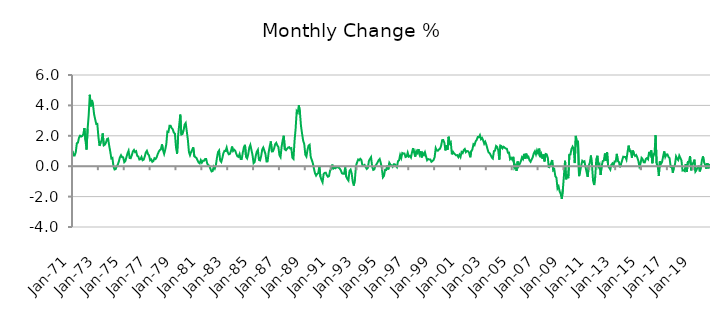
| Category | Series 0 |
|---|---|
| 1971-01-01 | 1.014 |
| 1971-02-01 | 0.711 |
| 1971-03-01 | 0.712 |
| 1971-04-01 | 0.919 |
| 1971-05-01 | 1.51 |
| 1971-06-01 | 1.551 |
| 1971-07-01 | 1.878 |
| 1971-08-01 | 2.005 |
| 1971-09-01 | 1.95 |
| 1971-10-01 | 1.987 |
| 1971-11-01 | 2.104 |
| 1971-12-01 | 2.509 |
| 1972-01-01 | 1.699 |
| 1972-02-01 | 1.094 |
| 1972-03-01 | 2.462 |
| 1972-04-01 | 3.36 |
| 1972-05-01 | 4.697 |
| 1972-06-01 | 3.937 |
| 1972-07-01 | 4.355 |
| 1972-08-01 | 4.026 |
| 1972-09-01 | 3.417 |
| 1972-10-01 | 3.088 |
| 1972-11-01 | 2.774 |
| 1972-12-01 | 2.784 |
| 1973-01-01 | 1.938 |
| 1973-02-01 | 1.343 |
| 1973-03-01 | 1.524 |
| 1973-04-01 | 1.712 |
| 1973-05-01 | 2.158 |
| 1973-06-01 | 1.373 |
| 1973-07-01 | 1.418 |
| 1973-08-01 | 1.551 |
| 1973-09-01 | 1.782 |
| 1973-10-01 | 1.816 |
| 1973-11-01 | 1.359 |
| 1973-12-01 | 0.961 |
| 1974-01-01 | 0.511 |
| 1974-02-01 | 0.548 |
| 1974-03-01 | -0.022 |
| 1974-04-01 | -0.216 |
| 1974-05-01 | -0.191 |
| 1974-06-01 | 0.007 |
| 1974-07-01 | 0.097 |
| 1974-08-01 | 0.326 |
| 1974-09-01 | 0.591 |
| 1974-10-01 | 0.722 |
| 1974-11-01 | 0.594 |
| 1974-12-01 | 0.583 |
| 1975-01-01 | 0.268 |
| 1975-02-01 | 0.337 |
| 1975-03-01 | 0.597 |
| 1975-04-01 | 0.845 |
| 1975-05-01 | 1.017 |
| 1975-06-01 | 0.539 |
| 1975-07-01 | 0.526 |
| 1975-08-01 | 0.722 |
| 1975-09-01 | 0.97 |
| 1975-10-01 | 1.067 |
| 1975-11-01 | 0.93 |
| 1975-12-01 | 0.985 |
| 1976-01-01 | 0.687 |
| 1976-02-01 | 0.643 |
| 1976-03-01 | 0.437 |
| 1976-04-01 | 0.463 |
| 1976-05-01 | 0.603 |
| 1976-06-01 | 0.392 |
| 1976-07-01 | 0.432 |
| 1976-08-01 | 0.636 |
| 1976-09-01 | 0.905 |
| 1976-10-01 | 1.011 |
| 1976-11-01 | 0.8 |
| 1976-12-01 | 0.709 |
| 1977-01-01 | 0.392 |
| 1977-02-01 | 0.448 |
| 1977-03-01 | 0.289 |
| 1977-04-01 | 0.338 |
| 1977-05-01 | 0.521 |
| 1977-06-01 | 0.47 |
| 1977-07-01 | 0.575 |
| 1977-08-01 | 0.784 |
| 1977-09-01 | 0.951 |
| 1977-10-01 | 1.061 |
| 1977-11-01 | 1.111 |
| 1977-12-01 | 1.434 |
| 1978-01-01 | 1.05 |
| 1978-02-01 | 0.811 |
| 1978-03-01 | 1.084 |
| 1978-04-01 | 1.443 |
| 1978-05-01 | 2.28 |
| 1978-06-01 | 2.255 |
| 1978-07-01 | 2.668 |
| 1978-08-01 | 2.665 |
| 1978-09-01 | 2.498 |
| 1978-10-01 | 2.424 |
| 1978-11-01 | 2.207 |
| 1978-12-01 | 2.133 |
| 1979-01-01 | 1.242 |
| 1979-02-01 | 0.823 |
| 1979-03-01 | 2.034 |
| 1979-04-01 | 2.732 |
| 1979-05-01 | 3.394 |
| 1979-06-01 | 2.083 |
| 1979-07-01 | 2.118 |
| 1979-08-01 | 2.335 |
| 1979-09-01 | 2.734 |
| 1979-10-01 | 2.841 |
| 1979-11-01 | 2.3 |
| 1979-12-01 | 1.747 |
| 1980-01-01 | 0.943 |
| 1980-02-01 | 0.726 |
| 1980-03-01 | 0.925 |
| 1980-04-01 | 1.073 |
| 1980-05-01 | 1.242 |
| 1980-06-01 | 0.656 |
| 1980-07-01 | 0.591 |
| 1980-08-01 | 0.543 |
| 1980-09-01 | 0.381 |
| 1980-10-01 | 0.243 |
| 1980-11-01 | 0.186 |
| 1980-12-01 | 0.395 |
| 1981-01-01 | 0.234 |
| 1981-02-01 | 0.354 |
| 1981-03-01 | 0.354 |
| 1981-04-01 | 0.474 |
| 1981-05-01 | 0.478 |
| 1981-06-01 | 0.161 |
| 1981-07-01 | 0.077 |
| 1981-08-01 | 0.019 |
| 1981-09-01 | -0.188 |
| 1981-10-01 | -0.344 |
| 1981-11-01 | -0.317 |
| 1981-12-01 | -0.035 |
| 1982-01-01 | -0.155 |
| 1982-02-01 | 0.068 |
| 1982-03-01 | 0.555 |
| 1982-04-01 | 0.929 |
| 1982-05-01 | 1.031 |
| 1982-06-01 | 0.372 |
| 1982-07-01 | 0.28 |
| 1982-08-01 | 0.532 |
| 1982-09-01 | 0.859 |
| 1982-10-01 | 1.012 |
| 1982-11-01 | 0.998 |
| 1982-12-01 | 1.225 |
| 1983-01-01 | 0.92 |
| 1983-02-01 | 0.783 |
| 1983-03-01 | 0.81 |
| 1983-04-01 | 0.995 |
| 1983-05-01 | 1.293 |
| 1983-06-01 | 1.001 |
| 1983-07-01 | 1.08 |
| 1983-08-01 | 1.015 |
| 1983-09-01 | 0.803 |
| 1983-10-01 | 0.652 |
| 1983-11-01 | 0.611 |
| 1983-12-01 | 0.798 |
| 1984-01-01 | 0.473 |
| 1984-02-01 | 0.478 |
| 1984-03-01 | 0.903 |
| 1984-04-01 | 1.241 |
| 1984-05-01 | 1.404 |
| 1984-06-01 | 0.614 |
| 1984-07-01 | 0.511 |
| 1984-08-01 | 0.774 |
| 1984-09-01 | 1.225 |
| 1984-10-01 | 1.401 |
| 1984-11-01 | 1.068 |
| 1984-12-01 | 0.734 |
| 1985-01-01 | 0.202 |
| 1985-02-01 | 0.279 |
| 1985-03-01 | 0.684 |
| 1985-04-01 | 0.954 |
| 1985-05-01 | 1.079 |
| 1985-06-01 | 0.413 |
| 1985-07-01 | 0.38 |
| 1985-08-01 | 0.656 |
| 1985-09-01 | 1.087 |
| 1985-10-01 | 1.228 |
| 1985-11-01 | 1.02 |
| 1985-12-01 | 0.807 |
| 1986-01-01 | 0.311 |
| 1986-02-01 | 0.317 |
| 1986-03-01 | 0.923 |
| 1986-04-01 | 1.322 |
| 1986-05-01 | 1.629 |
| 1986-06-01 | 0.97 |
| 1986-07-01 | 0.982 |
| 1986-08-01 | 1.161 |
| 1986-09-01 | 1.443 |
| 1986-10-01 | 1.536 |
| 1986-11-01 | 1.373 |
| 1986-12-01 | 1.263 |
| 1987-01-01 | 0.724 |
| 1987-02-01 | 0.595 |
| 1987-03-01 | 1.283 |
| 1987-04-01 | 1.705 |
| 1987-05-01 | 2.003 |
| 1987-06-01 | 1.108 |
| 1987-07-01 | 1.049 |
| 1987-08-01 | 1.142 |
| 1987-09-01 | 1.226 |
| 1987-10-01 | 1.253 |
| 1987-11-01 | 1.16 |
| 1987-12-01 | 1.188 |
| 1988-01-01 | 0.558 |
| 1988-02-01 | 0.478 |
| 1988-03-01 | 1.666 |
| 1988-04-01 | 2.466 |
| 1988-05-01 | 3.62 |
| 1988-06-01 | 3.526 |
| 1988-07-01 | 4.01 |
| 1988-08-01 | 3.546 |
| 1988-09-01 | 2.637 |
| 1988-10-01 | 2.133 |
| 1988-11-01 | 1.68 |
| 1988-12-01 | 1.467 |
| 1989-01-01 | 0.756 |
| 1989-02-01 | 0.634 |
| 1989-03-01 | 1.069 |
| 1989-04-01 | 1.347 |
| 1989-05-01 | 1.408 |
| 1989-06-01 | 0.607 |
| 1989-07-01 | 0.411 |
| 1989-08-01 | 0.192 |
| 1989-09-01 | -0.165 |
| 1989-10-01 | -0.462 |
| 1989-11-01 | -0.618 |
| 1989-12-01 | -0.507 |
| 1990-01-01 | -0.459 |
| 1990-02-01 | -0.019 |
| 1990-03-01 | -0.686 |
| 1990-04-01 | -0.897 |
| 1990-05-01 | -1.058 |
| 1990-06-01 | -0.51 |
| 1990-07-01 | -0.437 |
| 1990-08-01 | -0.428 |
| 1990-09-01 | -0.604 |
| 1990-10-01 | -0.695 |
| 1990-11-01 | -0.649 |
| 1990-12-01 | -0.278 |
| 1991-01-01 | -0.196 |
| 1991-02-01 | 0.105 |
| 1991-03-01 | -0.159 |
| 1991-04-01 | -0.105 |
| 1991-05-01 | -0.139 |
| 1991-06-01 | -0.062 |
| 1991-07-01 | -0.066 |
| 1991-08-01 | -0.093 |
| 1991-09-01 | -0.159 |
| 1991-10-01 | -0.285 |
| 1991-11-01 | -0.467 |
| 1991-12-01 | -0.497 |
| 1992-01-01 | -0.494 |
| 1992-02-01 | -0.076 |
| 1992-03-01 | -0.697 |
| 1992-04-01 | -0.848 |
| 1992-05-01 | -0.944 |
| 1992-06-01 | -0.312 |
| 1992-07-01 | -0.225 |
| 1992-08-01 | -0.473 |
| 1992-09-01 | -1.015 |
| 1992-10-01 | -1.272 |
| 1992-11-01 | -0.873 |
| 1992-12-01 | 0.026 |
| 1993-01-01 | 0.247 |
| 1993-02-01 | 0.437 |
| 1993-03-01 | 0.391 |
| 1993-04-01 | 0.487 |
| 1993-05-01 | 0.413 |
| 1993-06-01 | 0.047 |
| 1993-07-01 | 0.03 |
| 1993-08-01 | 0.082 |
| 1993-09-01 | -0.063 |
| 1993-10-01 | -0.18 |
| 1993-11-01 | -0.118 |
| 1993-12-01 | 0.35 |
| 1994-01-01 | 0.48 |
| 1994-02-01 | 0.595 |
| 1994-03-01 | -0.023 |
| 1994-04-01 | -0.241 |
| 1994-05-01 | -0.212 |
| 1994-06-01 | 0.019 |
| 1994-07-01 | 0.12 |
| 1994-08-01 | 0.247 |
| 1994-09-01 | 0.391 |
| 1994-10-01 | 0.472 |
| 1994-11-01 | 0.222 |
| 1994-12-01 | -0.131 |
| 1995-01-01 | -0.733 |
| 1995-02-01 | -0.635 |
| 1995-03-01 | -0.24 |
| 1995-04-01 | -0.251 |
| 1995-05-01 | 0.043 |
| 1995-06-01 | -0.212 |
| 1995-07-01 | 0.218 |
| 1995-08-01 | 0.097 |
| 1995-09-01 | 0.057 |
| 1995-10-01 | -0.036 |
| 1995-11-01 | 0.126 |
| 1995-12-01 | 0.123 |
| 1996-01-01 | 0.036 |
| 1996-02-01 | -0.061 |
| 1996-03-01 | 0.33 |
| 1996-04-01 | 0.389 |
| 1996-05-01 | 0.736 |
| 1996-06-01 | 0.535 |
| 1996-07-01 | 0.868 |
| 1996-08-01 | 0.833 |
| 1996-09-01 | 0.834 |
| 1996-10-01 | 0.603 |
| 1996-11-01 | 0.635 |
| 1996-12-01 | 0.892 |
| 1997-01-01 | 0.634 |
| 1997-02-01 | 0.672 |
| 1997-03-01 | 0.57 |
| 1997-04-01 | 0.919 |
| 1997-05-01 | 1.19 |
| 1997-06-01 | 0.893 |
| 1997-07-01 | 0.625 |
| 1997-08-01 | 0.99 |
| 1997-09-01 | 0.877 |
| 1997-10-01 | 1.126 |
| 1997-11-01 | 0.779 |
| 1997-12-01 | 0.981 |
| 1998-01-01 | 0.576 |
| 1998-02-01 | 0.861 |
| 1998-03-01 | 0.744 |
| 1998-04-01 | 0.917 |
| 1998-05-01 | 0.646 |
| 1998-06-01 | 0.394 |
| 1998-07-01 | 0.47 |
| 1998-08-01 | 0.438 |
| 1998-09-01 | 0.441 |
| 1998-10-01 | 0.291 |
| 1998-11-01 | 0.339 |
| 1998-12-01 | 0.406 |
| 1999-01-01 | 0.599 |
| 1999-02-01 | 1.189 |
| 1999-03-01 | 1.036 |
| 1999-04-01 | 1.017 |
| 1999-05-01 | 1.102 |
| 1999-06-01 | 1.154 |
| 1999-07-01 | 1.343 |
| 1999-08-01 | 1.715 |
| 1999-09-01 | 1.719 |
| 1999-10-01 | 1.552 |
| 1999-11-01 | 1.038 |
| 1999-12-01 | 1.38 |
| 2000-01-01 | 1.085 |
| 2000-02-01 | 1.936 |
| 2000-03-01 | 1.491 |
| 2000-04-01 | 1.566 |
| 2000-05-01 | 0.781 |
| 2000-06-01 | 0.949 |
| 2000-07-01 | 0.839 |
| 2000-08-01 | 0.775 |
| 2000-09-01 | 0.714 |
| 2000-10-01 | 0.729 |
| 2000-11-01 | 0.596 |
| 2000-12-01 | 0.754 |
| 2001-01-01 | 0.606 |
| 2001-02-01 | 0.935 |
| 2001-03-01 | 0.867 |
| 2001-04-01 | 1.055 |
| 2001-05-01 | 1.127 |
| 2001-06-01 | 0.924 |
| 2001-07-01 | 0.998 |
| 2001-08-01 | 0.985 |
| 2001-09-01 | 0.883 |
| 2001-10-01 | 0.588 |
| 2001-11-01 | 0.997 |
| 2001-12-01 | 1.094 |
| 2002-01-01 | 1.445 |
| 2002-02-01 | 1.384 |
| 2002-03-01 | 1.631 |
| 2002-04-01 | 1.728 |
| 2002-05-01 | 1.918 |
| 2002-06-01 | 1.906 |
| 2002-07-01 | 2.048 |
| 2002-08-01 | 1.783 |
| 2002-09-01 | 1.859 |
| 2002-10-01 | 1.71 |
| 2002-11-01 | 1.477 |
| 2002-12-01 | 1.602 |
| 2003-01-01 | 1.407 |
| 2003-02-01 | 1.139 |
| 2003-03-01 | 0.91 |
| 2003-04-01 | 0.863 |
| 2003-05-01 | 0.726 |
| 2003-06-01 | 0.579 |
| 2003-07-01 | 0.508 |
| 2003-08-01 | 0.993 |
| 2003-09-01 | 1.027 |
| 2003-10-01 | 1.329 |
| 2003-11-01 | 1.273 |
| 2003-12-01 | 1.053 |
| 2004-01-01 | 0.433 |
| 2004-02-01 | 1.358 |
| 2004-03-01 | 1.317 |
| 2004-04-01 | 1.179 |
| 2004-05-01 | 1.278 |
| 2004-06-01 | 1.218 |
| 2004-07-01 | 1.163 |
| 2004-08-01 | 1.146 |
| 2004-09-01 | 0.887 |
| 2004-10-01 | 0.892 |
| 2004-11-01 | 0.464 |
| 2004-12-01 | 0.546 |
| 2005-01-01 | 0.433 |
| 2005-02-01 | 0.615 |
| 2005-03-01 | -0.094 |
| 2005-04-01 | 0.035 |
| 2005-05-01 | -0.308 |
| 2005-06-01 | 0.31 |
| 2005-07-01 | 0.014 |
| 2005-08-01 | 0.163 |
| 2005-09-01 | 0.324 |
| 2005-10-01 | 0.577 |
| 2005-11-01 | 0.466 |
| 2005-12-01 | 0.812 |
| 2006-01-01 | 0.5 |
| 2006-02-01 | 0.828 |
| 2006-03-01 | 0.563 |
| 2006-04-01 | 0.621 |
| 2006-05-01 | 0.386 |
| 2006-06-01 | 0.291 |
| 2006-07-01 | 0.438 |
| 2006-08-01 | 0.591 |
| 2006-09-01 | 0.848 |
| 2006-10-01 | 0.979 |
| 2006-11-01 | 0.775 |
| 2006-12-01 | 1.037 |
| 2007-01-01 | 0.858 |
| 2007-02-01 | 1.157 |
| 2007-03-01 | 0.591 |
| 2007-04-01 | 0.791 |
| 2007-05-01 | 0.495 |
| 2007-06-01 | 0.773 |
| 2007-07-01 | 0.314 |
| 2007-08-01 | 0.802 |
| 2007-09-01 | 0.779 |
| 2007-10-01 | 0.566 |
| 2007-11-01 | -0.121 |
| 2007-12-01 | 0.07 |
| 2008-01-01 | 0.193 |
| 2008-02-01 | 0.407 |
| 2008-03-01 | -0.27 |
| 2008-04-01 | -0.198 |
| 2008-05-01 | -0.666 |
| 2008-06-01 | -0.763 |
| 2008-07-01 | -1.456 |
| 2008-08-01 | -1.333 |
| 2008-09-01 | -1.666 |
| 2008-10-01 | -1.827 |
| 2008-11-01 | -2.152 |
| 2008-12-01 | -1.511 |
| 2009-01-01 | -0.593 |
| 2009-02-01 | 0.356 |
| 2009-03-01 | -0.862 |
| 2009-04-01 | -0.536 |
| 2009-05-01 | -0.786 |
| 2009-06-01 | 0.762 |
| 2009-07-01 | 0.77 |
| 2009-08-01 | 1.139 |
| 2009-09-01 | 1.284 |
| 2009-10-01 | 1.145 |
| 2009-11-01 | 0.204 |
| 2009-12-01 | 1.994 |
| 2010-01-01 | 1.536 |
| 2010-02-01 | 1.676 |
| 2010-03-01 | -0.651 |
| 2010-04-01 | -0.343 |
| 2010-05-01 | 0.049 |
| 2010-06-01 | 0.354 |
| 2010-07-01 | 0.283 |
| 2010-08-01 | 0.323 |
| 2010-09-01 | -0.047 |
| 2010-10-01 | -0.391 |
| 2010-11-01 | -0.701 |
| 2010-12-01 | 0.034 |
| 2011-01-01 | 0.244 |
| 2011-02-01 | 0.703 |
| 2011-03-01 | 0.059 |
| 2011-04-01 | -0.947 |
| 2011-05-01 | -1.241 |
| 2011-06-01 | -0.69 |
| 2011-07-01 | 0.458 |
| 2011-08-01 | 0.687 |
| 2011-09-01 | -0.023 |
| 2011-10-01 | 0.118 |
| 2011-11-01 | -0.58 |
| 2011-12-01 | 0.04 |
| 2012-01-01 | 0.333 |
| 2012-02-01 | 0.371 |
| 2012-03-01 | 0.836 |
| 2012-04-01 | 0.354 |
| 2012-05-01 | 0.924 |
| 2012-06-01 | -0.009 |
| 2012-07-01 | -0.101 |
| 2012-08-01 | -0.222 |
| 2012-09-01 | 0.107 |
| 2012-10-01 | 0.182 |
| 2012-11-01 | 0.049 |
| 2012-12-01 | 0.313 |
| 2013-01-01 | 0.306 |
| 2013-02-01 | 0.812 |
| 2013-03-01 | 0.345 |
| 2013-04-01 | 0.271 |
| 2013-05-01 | -0.069 |
| 2013-06-01 | 0.154 |
| 2013-07-01 | 0.387 |
| 2013-08-01 | 0.627 |
| 2013-09-01 | 0.614 |
| 2013-10-01 | 0.608 |
| 2013-11-01 | 0.433 |
| 2013-12-01 | 0.932 |
| 2014-01-01 | 1.351 |
| 2014-02-01 | 0.99 |
| 2014-03-01 | 1.002 |
| 2014-04-01 | 0.559 |
| 2014-05-01 | 1.028 |
| 2014-06-01 | 0.79 |
| 2014-07-01 | 0.675 |
| 2014-08-01 | 0.734 |
| 2014-09-01 | 0.578 |
| 2014-10-01 | 0.359 |
| 2014-11-01 | -0.016 |
| 2014-12-01 | 0.161 |
| 2015-01-01 | 0.547 |
| 2015-02-01 | 0.467 |
| 2015-03-01 | 0.257 |
| 2015-04-01 | 0.25 |
| 2015-05-01 | 0.484 |
| 2015-06-01 | 0.532 |
| 2015-07-01 | 0.454 |
| 2015-08-01 | 0.94 |
| 2015-09-01 | 0.754 |
| 2015-10-01 | 1.045 |
| 2015-11-01 | 0.196 |
| 2015-12-01 | 0.79 |
| 2016-01-01 | 0.777 |
| 2016-02-01 | 2.042 |
| 2016-03-01 | 0.162 |
| 2016-04-01 | 0.005 |
| 2016-05-01 | -0.638 |
| 2016-06-01 | 0.315 |
| 2016-07-01 | 0.149 |
| 2016-08-01 | 0.276 |
| 2016-09-01 | 0.638 |
| 2016-10-01 | 0.971 |
| 2016-11-01 | 0.611 |
| 2016-12-01 | 0.773 |
| 2017-01-01 | 0.778 |
| 2017-02-01 | 0.608 |
| 2017-03-01 | 0.525 |
| 2017-04-01 | -0.033 |
| 2017-05-01 | -0.003 |
| 2017-06-01 | -0.431 |
| 2017-07-01 | -0.06 |
| 2017-08-01 | 0.117 |
| 2017-09-01 | 0.643 |
| 2017-10-01 | 0.49 |
| 2017-11-01 | 0.401 |
| 2017-12-01 | 0.694 |
| 2018-01-01 | 0.546 |
| 2018-02-01 | 0.383 |
| 2018-03-01 | -0.286 |
| 2018-04-01 | -0.269 |
| 2018-05-01 | -0.322 |
| 2018-06-01 | 0.146 |
| 2018-07-01 | -0.37 |
| 2018-08-01 | 0.285 |
| 2018-09-01 | 0.297 |
| 2018-10-01 | 0.665 |
| 2018-11-01 | -0.272 |
| 2018-12-01 | 0.186 |
| 2019-01-01 | 0.178 |
| 2019-02-01 | 0.431 |
| 2019-03-01 | -0.351 |
| 2019-04-01 | -0.248 |
| 2019-05-01 | -0.049 |
| 2019-06-01 | -0.009 |
| 2019-07-01 | -0.346 |
| 2019-08-01 | -0.114 |
| 2019-09-01 | 0.394 |
| 2019-10-01 | 0.644 |
| 2019-11-01 | 0.262 |
| 2019-12-01 | 0.094 |
| 2020-01-01 | -0.162 |
| 2020-02-01 | 0.205 |
| 2020-03-01 | -0.141 |
| 2020-04-01 | 0.15 |